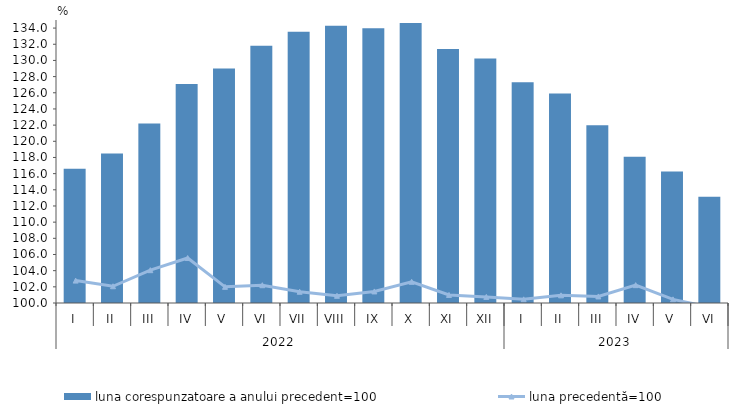
| Category | luna corespunzatoare a anului precedent=100 |
|---|---|
| 0 | 116.6 |
| 1 | 118.5 |
| 2 | 122.2 |
| 3 | 127.1 |
| 4 | 129 |
| 5 | 131.8 |
| 6 | 133.55 |
| 7 | 134.29 |
| 8 | 133.97 |
| 9 | 134.62 |
| 10 | 131.4 |
| 11 | 130.24 |
| 12 | 127.307 |
| 13 | 125.905 |
| 14 | 121.977 |
| 15 | 118.102 |
| 16 | 116.262 |
| 17 | 113.152 |